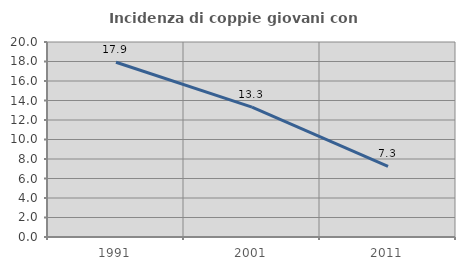
| Category | Incidenza di coppie giovani con figli |
|---|---|
| 1991.0 | 17.918 |
| 2001.0 | 13.321 |
| 2011.0 | 7.252 |